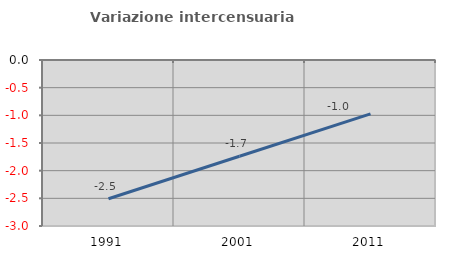
| Category | Variazione intercensuaria annua |
|---|---|
| 1991.0 | -2.508 |
| 2001.0 | -1.739 |
| 2011.0 | -0.974 |